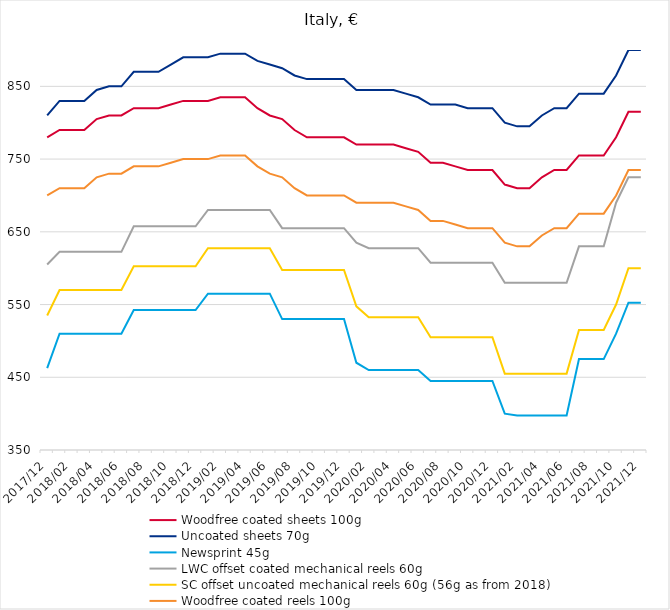
| Category | Woodfree coated sheets 100g | Uncoated sheets 70g | Newsprint 45g | LWC offset coated mechanical reels 60g | SC offset uncoated mechanical reels 60g (56g as from 2018) | Woodfree coated reels 100g |
|---|---|---|---|---|---|---|
| 2017/12 | 780 | 810 | 462.5 | 605 | 535 | 700 |
| 2018/01 | 790 | 830 | 510 | 622.5 | 570 | 710 |
| 2018/02 | 790 | 830 | 510 | 622.5 | 570 | 710 |
| 2018/03 | 790 | 830 | 510 | 622.5 | 570 | 710 |
| 2018/04 | 805 | 845 | 510 | 622.5 | 570 | 725 |
| 2018/05 | 810 | 850 | 510 | 622.5 | 570 | 730 |
| 2018/06 | 810 | 850 | 510 | 622.5 | 570 | 730 |
| 2018/07 | 820 | 870 | 542.5 | 657.5 | 602.5 | 740 |
| 2018/08 | 820 | 870 | 542.5 | 657.5 | 602.5 | 740 |
| 2018/09 | 820 | 870 | 542.5 | 657.5 | 602.5 | 740 |
| 2018/10 | 825 | 880 | 542.5 | 657.5 | 602.5 | 745 |
| 2018/11 | 830 | 890 | 542.5 | 657.5 | 602.5 | 750 |
| 2018/12 | 830 | 890 | 542.5 | 657.5 | 602.5 | 750 |
| 2019/01 | 830 | 890 | 565 | 680 | 627.5 | 750 |
| 2019/02 | 835 | 895 | 565 | 680 | 627.5 | 755 |
| 2019/03 | 835 | 895 | 565 | 680 | 627.5 | 755 |
| 2019/04 | 835 | 895 | 565 | 680 | 627.5 | 755 |
| 2019/05 | 820 | 885 | 565 | 680 | 627.5 | 740 |
| 2019/06 | 810 | 880 | 565 | 680 | 627.5 | 730 |
| 2019/07 | 805 | 875 | 530 | 655 | 597.5 | 725 |
| 2019/08 | 790 | 865 | 530 | 655 | 597.5 | 710 |
| 2019/09 | 780 | 860 | 530 | 655 | 597.5 | 700 |
| 2019/10 | 780 | 860 | 530 | 655 | 597.5 | 700 |
| 2019/11 | 780 | 860 | 530 | 655 | 597.5 | 700 |
| 2019/12 | 780 | 860 | 530 | 655 | 597.5 | 700 |
| 2020/01 | 770 | 845 | 470 | 635 | 547.5 | 690 |
| 2020/02 | 770 | 845 | 460 | 627.5 | 532.5 | 690 |
| 2020/03 | 770 | 845 | 460 | 627.5 | 532.5 | 690 |
| 2020/04 | 770 | 845 | 460 | 627.5 | 532.5 | 690 |
| 2020/05 | 765 | 840 | 460 | 627.5 | 532.5 | 685 |
| 2020/06 | 760 | 835 | 460 | 627.5 | 532.5 | 680 |
| 2020/07 | 745 | 825 | 445 | 607.5 | 505 | 665 |
| 2020/08 | 745 | 825 | 445 | 607.5 | 505 | 665 |
| 2020/09 | 740 | 825 | 445 | 607.5 | 505 | 660 |
| 2020/10 | 735 | 820 | 445 | 607.5 | 505 | 655 |
| 2020/11 | 735 | 820 | 445 | 607.5 | 505 | 655 |
| 2020/12 | 735 | 820 | 445 | 607.5 | 505 | 655 |
| 2021/01 | 715 | 800 | 400 | 580 | 455 | 635 |
| 2021/02 | 710 | 795 | 397.5 | 580 | 455 | 630 |
| 2021/03 | 710 | 795 | 397.5 | 580 | 455 | 630 |
| 2021/04 | 725 | 810 | 397.5 | 580 | 455 | 645 |
| 2021/05 | 735 | 820 | 397.5 | 580 | 455 | 655 |
| 2021/06 | 735 | 820 | 397.5 | 580 | 455 | 655 |
| 2021/07 | 755 | 840 | 475 | 630 | 515 | 675 |
| 2021/08 | 755 | 840 | 475 | 630 | 515 | 675 |
| 2021/09 | 755 | 840 | 475 | 630 | 515 | 675 |
| 2021/10 | 780 | 865 | 510 | 690 | 550 | 700 |
| 2021/11 | 815 | 900 | 552.5 | 725 | 600 | 735 |
| 2021/12 | 815 | 900 | 552.5 | 725 | 600 | 735 |